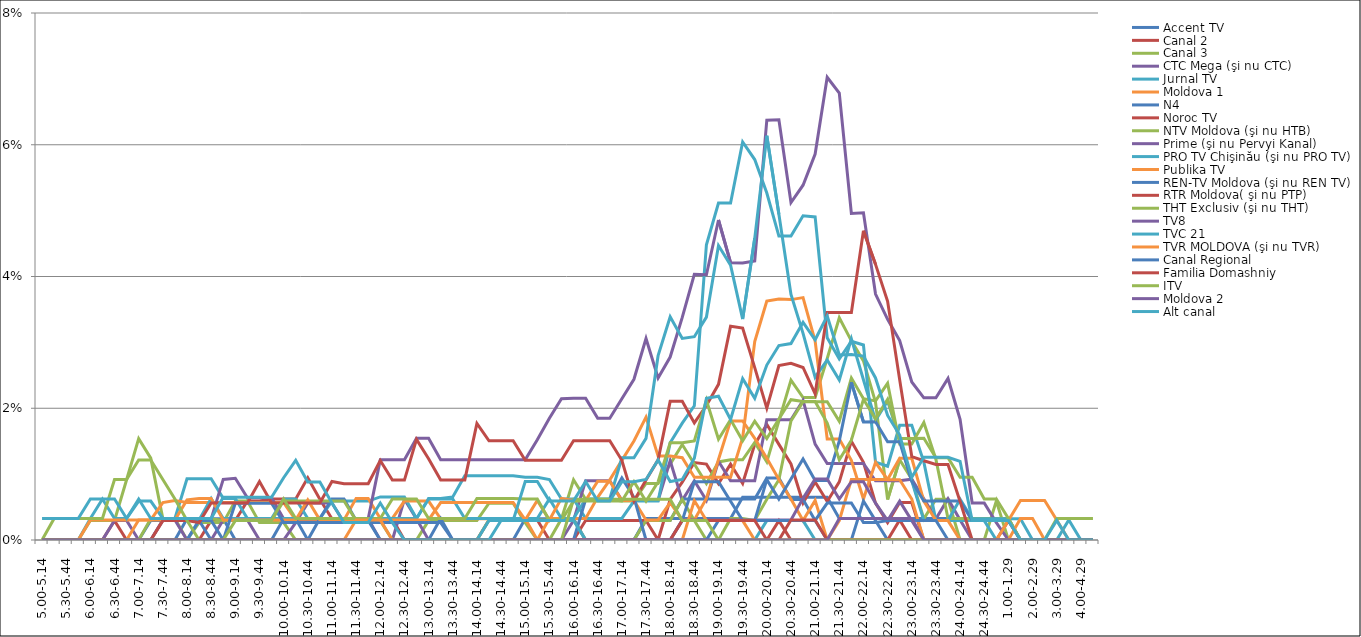
| Category | Accent TV | Canal 2 | Canal 3 | CTC Mega (şi nu CTC) | Jurnal TV | Moldova 1 | N4 | Noroc TV | NTV Moldova (şi nu HTB) | Prime (şi nu Pervyi Kanal) | PRO TV Chişinău (şi nu PRO TV) | Publika TV  | REN-TV Moldova (şi nu REN TV)  | RTR Moldova( şi nu PTP)  | THT Exclusiv (şi nu THT) | TV8 | TVC 21 | TVR MOLDOVA (şi nu TVR) | Canal Regional | Familia Domashniy | ITV | Moldova 2 | Alt canal |
|---|---|---|---|---|---|---|---|---|---|---|---|---|---|---|---|---|---|---|---|---|---|---|---|
| 5.00-5.14 | 0 | 0 | 0 | 0 | 0 | 0 | 0 | 0 | 0 | 0 | 0 | 0 | 0 | 0 | 0 | 0 | 0 | 0 | 0 | 0 | 0 | 0 | 0.003 |
| 5.15-5.29 | 0 | 0 | 0 | 0 | 0 | 0 | 0 | 0 | 0 | 0 | 0 | 0 | 0 | 0 | 0.003 | 0 | 0 | 0 | 0 | 0 | 0 | 0 | 0.003 |
| 5.30-5.44 | 0 | 0 | 0 | 0 | 0 | 0 | 0 | 0 | 0 | 0 | 0 | 0 | 0 | 0 | 0.003 | 0 | 0 | 0 | 0 | 0 | 0 | 0 | 0.003 |
| 5.45-5.59 | 0 | 0 | 0 | 0 | 0 | 0 | 0 | 0 | 0 | 0 | 0 | 0 | 0 | 0 | 0.003 | 0 | 0 | 0 | 0 | 0 | 0 | 0 | 0.003 |
| 6.00-6.14 | 0 | 0 | 0.003 | 0 | 0.003 | 0.003 | 0 | 0 | 0 | 0 | 0 | 0 | 0 | 0 | 0.003 | 0 | 0 | 0 | 0 | 0 | 0 | 0 | 0.006 |
| 6.15-6.29 | 0 | 0 | 0.003 | 0 | 0.006 | 0.003 | 0 | 0 | 0 | 0 | 0 | 0 | 0 | 0 | 0.003 | 0 | 0 | 0 | 0 | 0 | 0 | 0 | 0.006 |
| 6.30-6.44 | 0 | 0.003 | 0.003 | 0.003 | 0.003 | 0.003 | 0 | 0 | 0 | 0 | 0 | 0 | 0 | 0 | 0.009 | 0 | 0 | 0 | 0 | 0 | 0 | 0 | 0.006 |
| 6.45-6.59 | 0 | 0 | 0.009 | 0.003 | 0.003 | 0.003 | 0 | 0 | 0 | 0 | 0 | 0 | 0 | 0 | 0.009 | 0 | 0 | 0 | 0 | 0 | 0 | 0 | 0.003 |
| 7.00-7.14 | 0 | 0 | 0.015 | 0 | 0.006 | 0.003 | 0 | 0 | 0 | 0 | 0 | 0.003 | 0 | 0 | 0.012 | 0 | 0 | 0 | 0 | 0 | 0 | 0 | 0.006 |
| 7.15-7.29 | 0 | 0 | 0.012 | 0 | 0.006 | 0.003 | 0.003 | 0 | 0.003 | 0 | 0 | 0.003 | 0 | 0 | 0.012 | 0 | 0 | 0 | 0 | 0 | 0 | 0 | 0.003 |
| 7.30-7.44 | 0 | 0 | 0.003 | 0.003 | 0.003 | 0.006 | 0.003 | 0 | 0.003 | 0.003 | 0 | 0.003 | 0 | 0.003 | 0.009 | 0 | 0 | 0 | 0 | 0 | 0 | 0 | 0.003 |
| 7.45-7.59 | 0 | 0 | 0.003 | 0.003 | 0.003 | 0.006 | 0.003 | 0 | 0.003 | 0.003 | 0 | 0.003 | 0 | 0.003 | 0.006 | 0 | 0 | 0 | 0 | 0 | 0 | 0 | 0.003 |
| 8.00-8.14 | 0.003 | 0 | 0 | 0 | 0.009 | 0.006 | 0.003 | 0 | 0.003 | 0.003 | 0 | 0.006 | 0 | 0.003 | 0.003 | 0 | 0 | 0 | 0 | 0 | 0 | 0 | 0.003 |
| 8.15-8.29 | 0.003 | 0 | 0.003 | 0 | 0.009 | 0.006 | 0.003 | 0 | 0.003 | 0.003 | 0.003 | 0.006 | 0.003 | 0.003 | 0 | 0 | 0 | 0 | 0 | 0 | 0 | 0 | 0.003 |
| 8.30-8.44 | 0.003 | 0.003 | 0.003 | 0 | 0.009 | 0.006 | 0 | 0 | 0.003 | 0.003 | 0.006 | 0.006 | 0.003 | 0.006 | 0 | 0 | 0 | 0 | 0 | 0 | 0 | 0 | 0.003 |
| 8.45-8.59 | 0.003 | 0.003 | 0.003 | 0.003 | 0.006 | 0.006 | 0 | 0 | 0.003 | 0.009 | 0.003 | 0.003 | 0 | 0.006 | 0 | 0 | 0 | 0 | 0 | 0 | 0 | 0 | 0.006 |
| 9.00-9.14 | 0 | 0.003 | 0.006 | 0.003 | 0.006 | 0.006 | 0 | 0 | 0.003 | 0.009 | 0.003 | 0.003 | 0.006 | 0.006 | 0.003 | 0 | 0 | 0 | 0 | 0 | 0 | 0 | 0.006 |
| 9.15-9.29 | 0 | 0.006 | 0.006 | 0.003 | 0.003 | 0.006 | 0 | 0 | 0.003 | 0.006 | 0.003 | 0.003 | 0.006 | 0.006 | 0.003 | 0 | 0 | 0 | 0 | 0 | 0 | 0 | 0.006 |
| 9.30-9.44 | 0 | 0.006 | 0.003 | 0 | 0.003 | 0.006 | 0 | 0 | 0.003 | 0.006 | 0.003 | 0.003 | 0.006 | 0.009 | 0.003 | 0 | 0 | 0 | 0 | 0 | 0 | 0 | 0.006 |
| 9.45-9.59 | 0 | 0.006 | 0.003 | 0 | 0.003 | 0.006 | 0 | 0 | 0.003 | 0.006 | 0.003 | 0.003 | 0.006 | 0.006 | 0.003 | 0 | 0 | 0 | 0 | 0 | 0 | 0 | 0.006 |
| 10.00-10.14 | 0 | 0.006 | 0.003 | 0 | 0.006 | 0.006 | 0.003 | 0 | 0.006 | 0.003 | 0.003 | 0.003 | 0.003 | 0.006 | 0.006 | 0 | 0 | 0 | 0 | 0 | 0 | 0 | 0.009 |
| 10.15-10.29 | 0 | 0.006 | 0 | 0.003 | 0.006 | 0.003 | 0.003 | 0 | 0.006 | 0.003 | 0.003 | 0.003 | 0.003 | 0.006 | 0.003 | 0 | 0 | 0 | 0 | 0 | 0 | 0 | 0.012 |
| 10.30-10.44 | 0 | 0.009 | 0 | 0.006 | 0.003 | 0.003 | 0 | 0 | 0.006 | 0.003 | 0.003 | 0.006 | 0.003 | 0.006 | 0.003 | 0 | 0 | 0 | 0 | 0 | 0 | 0 | 0.009 |
| 10.45-10.59 | 0 | 0.006 | 0 | 0.006 | 0.003 | 0.003 | 0.003 | 0 | 0.006 | 0.003 | 0.003 | 0.003 | 0.003 | 0.006 | 0.003 | 0 | 0 | 0 | 0 | 0 | 0 | 0 | 0.009 |
| 11.00-11.14 | 0 | 0.003 | 0 | 0.006 | 0.006 | 0.003 | 0.006 | 0 | 0.006 | 0.003 | 0.003 | 0.003 | 0.003 | 0.009 | 0.003 | 0 | 0 | 0 | 0 | 0 | 0 | 0 | 0.006 |
| 11.15-11.29 | 0 | 0.003 | 0 | 0.003 | 0.006 | 0.003 | 0.006 | 0 | 0.006 | 0.003 | 0.003 | 0.003 | 0.003 | 0.009 | 0.003 | 0 | 0 | 0 | 0 | 0 | 0 | 0 | 0.003 |
| 11.30-11.44 | 0 | 0.003 | 0 | 0.003 | 0.006 | 0.006 | 0.003 | 0 | 0.003 | 0.003 | 0.003 | 0.003 | 0.003 | 0.009 | 0.003 | 0 | 0 | 0.003 | 0 | 0 | 0 | 0 | 0.003 |
| 11.45-11.59 | 0 | 0.003 | 0 | 0.003 | 0.006 | 0.006 | 0.003 | 0 | 0.003 | 0.003 | 0.003 | 0.003 | 0.003 | 0.009 | 0.003 | 0 | 0 | 0.003 | 0 | 0 | 0 | 0 | 0.003 |
| 12.00-12.14 | 0 | 0.003 | 0 | 0 | 0.007 | 0.003 | 0 | 0 | 0.003 | 0.012 | 0.003 | 0.003 | 0.003 | 0.012 | 0.003 | 0 | 0 | 0.003 | 0 | 0 | 0 | 0 | 0.006 |
| 12.15-12.29 | 0 | 0.003 | 0 | 0 | 0.007 | 0.003 | 0 | 0 | 0 | 0.012 | 0.003 | 0.003 | 0.003 | 0.009 | 0.006 | 0 | 0 | 0 | 0 | 0 | 0 | 0 | 0.003 |
| 12.30-12.44 | 0 | 0 | 0 | 0.006 | 0.007 | 0.006 | 0 | 0 | 0 | 0.012 | 0.003 | 0.003 | 0.003 | 0.009 | 0.006 | 0 | 0 | 0 | 0 | 0 | 0 | 0 | 0 |
| 12.45-12.59 | 0 | 0 | 0 | 0.003 | 0.003 | 0.006 | 0 | 0 | 0 | 0.015 | 0.003 | 0.003 | 0.003 | 0.015 | 0.006 | 0 | 0 | 0 | 0 | 0 | 0 | 0 | 0 |
| 13.00-13.14 | 0 | 0 | 0.003 | 0 | 0.006 | 0.006 | 0 | 0 | 0 | 0.015 | 0.006 | 0.003 | 0.003 | 0.012 | 0.003 | 0 | 0 | 0 | 0 | 0 | 0 | 0 | 0 |
| 13.15-13.29 | 0 | 0 | 0.003 | 0 | 0.006 | 0.003 | 0.003 | 0 | 0 | 0.012 | 0.006 | 0.006 | 0.003 | 0.009 | 0.003 | 0 | 0 | 0 | 0 | 0 | 0 | 0 | 0 |
| 13.30-13.44 | 0 | 0 | 0.003 | 0 | 0.007 | 0.003 | 0 | 0 | 0 | 0.012 | 0.006 | 0.006 | 0 | 0.009 | 0.003 | 0 | 0 | 0 | 0 | 0 | 0 | 0 | 0 |
| 13.45-13.59 | 0 | 0 | 0.003 | 0 | 0.01 | 0.003 | 0 | 0 | 0 | 0.012 | 0.003 | 0.006 | 0 | 0.009 | 0.003 | 0 | 0 | 0 | 0 | 0 | 0 | 0 | 0 |
| 14.00-14.14 | 0 | 0 | 0.003 | 0 | 0.01 | 0.003 | 0 | 0 | 0 | 0.012 | 0.003 | 0.006 | 0 | 0.018 | 0.006 | 0 | 0 | 0 | 0 | 0 | 0 | 0 | 0 |
| 14.15-14.29 | 0 | 0.003 | 0.006 | 0 | 0.01 | 0.003 | 0 | 0 | 0.003 | 0.012 | 0.003 | 0.006 | 0 | 0.015 | 0.006 | 0 | 0.003 | 0 | 0 | 0 | 0 | 0 | 0 |
| 14.30-14.44 | 0 | 0.003 | 0.006 | 0 | 0.01 | 0.003 | 0 | 0 | 0.003 | 0.012 | 0.003 | 0.006 | 0 | 0.015 | 0.006 | 0 | 0.003 | 0 | 0 | 0 | 0 | 0 | 0.003 |
| 14.45-14.59 | 0 | 0.003 | 0.006 | 0 | 0.01 | 0.003 | 0 | 0 | 0.003 | 0.012 | 0.003 | 0.006 | 0 | 0.015 | 0.006 | 0 | 0.003 | 0 | 0 | 0 | 0 | 0 | 0.003 |
| 15.00-15.14 | 0.003 | 0.003 | 0.003 | 0 | 0.01 | 0.003 | 0 | 0 | 0.003 | 0.012 | 0.003 | 0.003 | 0 | 0.012 | 0.006 | 0 | 0.003 | 0 | 0 | 0 | 0 | 0 | 0.009 |
| 15.15-15.29 | 0.003 | 0.003 | 0 | 0 | 0.01 | 0 | 0 | 0 | 0.003 | 0.015 | 0.003 | 0.006 | 0 | 0.012 | 0.006 | 0 | 0.003 | 0 | 0 | 0 | 0 | 0 | 0.009 |
| 15.30-15.44 | 0.003 | 0 | 0 | 0 | 0.009 | 0.003 | 0 | 0 | 0.003 | 0.018 | 0.006 | 0.003 | 0 | 0.012 | 0.003 | 0 | 0.003 | 0 | 0 | 0 | 0 | 0 | 0.006 |
| 15.45-15.59 | 0.003 | 0 | 0.003 | 0 | 0.006 | 0.003 | 0 | 0 | 0.003 | 0.021 | 0.003 | 0.006 | 0 | 0.012 | 0.003 | 0 | 0.003 | 0 | 0 | 0 | 0 | 0 | 0.006 |
| 16.00-16.14 | 0.003 | 0 | 0.009 | 0.003 | 0.006 | 0.003 | 0 | 0 | 0.003 | 0.022 | 0.003 | 0.006 | 0 | 0.015 | 0.006 | 0 | 0.003 | 0 | 0 | 0 | 0.006 | 0 | 0.006 |
| 16.15-16.29 | 0 | 0.003 | 0.006 | 0.009 | 0.003 | 0.003 | 0 | 0 | 0 | 0.022 | 0.006 | 0.006 | 0.006 | 0.015 | 0.006 | 0 | 0 | 0 | 0 | 0 | 0.006 | 0 | 0.009 |
| 16.30-16.44 | 0 | 0.003 | 0.006 | 0.009 | 0.003 | 0.006 | 0 | 0 | 0 | 0.018 | 0.006 | 0.009 | 0.006 | 0.015 | 0.006 | 0 | 0 | 0 | 0 | 0 | 0.006 | 0 | 0.006 |
| 16.45-16.59 | 0 | 0.003 | 0.006 | 0.009 | 0.003 | 0.009 | 0 | 0 | 0 | 0.018 | 0.006 | 0.009 | 0.006 | 0.015 | 0.006 | 0 | 0 | 0 | 0 | 0 | 0.006 | 0 | 0.006 |
| 17.00-17.14 | 0 | 0.003 | 0.006 | 0.006 | 0.003 | 0.012 | 0 | 0 | 0 | 0.021 | 0.012 | 0.006 | 0.009 | 0.012 | 0.006 | 0 | 0 | 0 | 0 | 0 | 0.006 | 0 | 0.009 |
| 17.15-17.29 | 0 | 0.003 | 0.006 | 0.006 | 0.006 | 0.015 | 0 | 0 | 0 | 0.024 | 0.012 | 0.006 | 0.006 | 0.006 | 0.009 | 0 | 0 | 0 | 0 | 0 | 0.006 | 0 | 0.009 |
| 17.30-17.44 | 0.003 | 0.003 | 0.009 | 0.006 | 0.006 | 0.019 | 0.003 | 0 | 0.003 | 0.031 | 0.015 | 0.003 | 0 | 0.009 | 0.006 | 0 | 0 | 0 | 0 | 0 | 0.006 | 0 | 0.009 |
| 17.45-17.59 | 0.003 | 0 | 0.009 | 0.006 | 0.006 | 0.013 | 0.003 | 0 | 0.003 | 0.025 | 0.028 | 0.003 | 0 | 0.012 | 0.009 | 0 | 0 | 0 | 0 | 0 | 0.006 | 0 | 0.012 |
| 18.00-18.14 | 0.003 | 0.006 | 0.012 | 0.012 | 0.015 | 0.013 | 0.003 | 0 | 0.003 | 0.028 | 0.034 | 0.006 | 0 | 0.021 | 0.015 | 0 | 0 | 0 | 0 | 0 | 0.006 | 0 | 0.009 |
| 18.15-18.29 | 0.003 | 0.009 | 0.014 | 0.006 | 0.018 | 0.012 | 0.006 | 0 | 0.006 | 0.034 | 0.031 | 0.003 | 0.003 | 0.021 | 0.015 | 0.003 | 0 | 0 | 0 | 0.003 | 0.003 | 0 | 0.009 |
| 18.30-18.44 | 0.003 | 0.012 | 0.012 | 0.009 | 0.02 | 0.01 | 0.006 | 0 | 0.003 | 0.04 | 0.031 | 0.003 | 0.009 | 0.018 | 0.015 | 0.003 | 0 | 0.006 | 0 | 0.003 | 0.003 | 0 | 0.012 |
| 18.45-18.59 | 0.003 | 0.012 | 0.009 | 0.006 | 0.045 | 0.01 | 0.006 | 0 | 0 | 0.04 | 0.034 | 0.006 | 0.009 | 0.02 | 0.021 | 0.003 | 0 | 0.003 | 0 | 0.003 | 0.003 | 0 | 0.022 |
| 19.00-19.14 | 0.003 | 0.009 | 0.012 | 0.012 | 0.051 | 0.01 | 0.006 | 0 | 0 | 0.049 | 0.045 | 0.012 | 0.009 | 0.024 | 0.015 | 0.003 | 0 | 0.003 | 0.003 | 0.003 | 0 | 0 | 0.022 |
| 19.15-19.29 | 0.003 | 0.012 | 0.012 | 0.009 | 0.051 | 0.01 | 0.006 | 0 | 0.003 | 0.042 | 0.042 | 0.018 | 0.006 | 0.032 | 0.018 | 0.003 | 0 | 0.003 | 0.003 | 0.003 | 0 | 0 | 0.018 |
| 19.30-19.44 | 0.006 | 0.009 | 0.012 | 0.009 | 0.06 | 0.016 | 0.006 | 0 | 0.003 | 0.042 | 0.034 | 0.018 | 0.003 | 0.032 | 0.015 | 0.003 | 0 | 0.003 | 0.003 | 0.003 | 0 | 0 | 0.024 |
| 19.45-19.59 | 0.006 | 0.015 | 0.015 | 0.009 | 0.058 | 0.03 | 0.006 | 0 | 0.003 | 0.042 | 0.046 | 0.015 | 0.003 | 0.026 | 0.018 | 0.003 | 0 | 0 | 0.003 | 0.003 | 0 | 0 | 0.022 |
| 20.00-20.14 | 0.006 | 0.018 | 0.012 | 0.018 | 0.053 | 0.036 | 0.009 | 0 | 0.006 | 0.064 | 0.061 | 0.012 | 0.009 | 0.02 | 0.015 | 0.003 | 0.003 | 0 | 0.003 | 0 | 0 | 0 | 0.027 |
| 20.15-20.29 | 0.006 | 0.015 | 0.018 | 0.018 | 0.046 | 0.037 | 0.009 | 0.003 | 0.009 | 0.064 | 0.049 | 0.009 | 0.006 | 0.026 | 0.018 | 0.003 | 0.003 | 0 | 0.003 | 0 | 0 | 0 | 0.03 |
| 20.30-20.44 | 0.006 | 0.012 | 0.024 | 0.018 | 0.046 | 0.036 | 0.006 | 0 | 0.018 | 0.051 | 0.037 | 0.006 | 0.009 | 0.027 | 0.021 | 0.003 | 0.003 | 0 | 0.003 | 0.003 | 0 | 0 | 0.03 |
| 20.45-20.59 | 0.006 | 0.006 | 0.022 | 0.021 | 0.049 | 0.037 | 0.006 | 0 | 0.021 | 0.054 | 0.031 | 0.003 | 0.012 | 0.026 | 0.021 | 0.006 | 0.003 | 0 | 0.003 | 0.003 | 0 | 0 | 0.033 |
| 21.00-21.14 | 0.006 | 0.009 | 0.022 | 0.015 | 0.049 | 0.03 | 0.003 | 0 | 0.021 | 0.059 | 0.025 | 0.006 | 0.009 | 0.022 | 0.021 | 0.009 | 0 | 0 | 0.003 | 0.003 | 0 | 0 | 0.03 |
| 21.15-21.29 | 0.006 | 0.006 | 0.028 | 0.012 | 0.031 | 0.015 | 0 | 0 | 0.021 | 0.07 | 0.027 | 0 | 0.009 | 0.035 | 0.018 | 0.009 | 0 | 0 | 0.006 | 0 | 0 | 0 | 0.034 |
| 21.30-21.44 | 0.003 | 0.009 | 0.034 | 0.012 | 0.027 | 0.015 | 0 | 0 | 0.018 | 0.068 | 0.024 | 0.003 | 0.015 | 0.035 | 0.012 | 0.006 | 0 | 0 | 0.006 | 0 | 0 | 0.003 | 0.028 |
| 21.45-21.59 | 0.003 | 0.015 | 0.03 | 0.012 | 0.03 | 0.012 | 0 | 0 | 0.025 | 0.05 | 0.031 | 0.009 | 0.024 | 0.035 | 0.015 | 0.009 | 0 | 0 | 0.006 | 0 | 0 | 0.003 | 0.028 |
| 22.00-22.14 | 0.003 | 0.012 | 0.027 | 0.012 | 0.03 | 0.006 | 0.006 | 0 | 0.021 | 0.05 | 0.024 | 0.009 | 0.018 | 0.047 | 0.021 | 0.009 | 0 | 0 | 0.003 | 0 | 0 | 0.003 | 0.028 |
| 22.15-22.29 | 0.003 | 0.006 | 0.021 | 0.009 | 0.012 | 0.012 | 0.003 | 0 | 0.021 | 0.037 | 0.018 | 0.009 | 0.018 | 0.042 | 0.018 | 0.006 | 0 | 0 | 0.003 | 0 | 0 | 0.003 | 0.025 |
| 22.30-22.44 | 0.003 | 0.003 | 0.006 | 0.009 | 0.011 | 0.009 | 0 | 0 | 0.024 | 0.033 | 0.021 | 0.009 | 0.015 | 0.036 | 0.021 | 0.003 | 0 | 0 | 0.003 | 0 | 0 | 0.003 | 0.019 |
| 22.45-22.59 | 0.003 | 0.006 | 0.012 | 0.009 | 0.017 | 0.009 | 0 | 0.003 | 0.015 | 0.03 | 0.015 | 0.012 | 0.015 | 0.024 | 0.015 | 0.006 | 0 | 0 | 0.003 | 0 | 0 | 0.003 | 0.016 |
| 23.00-23.14 | 0.003 | 0.006 | 0.009 | 0.009 | 0.017 | 0.006 | 0 | 0 | 0.015 | 0.024 | 0.009 | 0.012 | 0.009 | 0.013 | 0.015 | 0.003 | 0 | 0 | 0.003 | 0 | 0 | 0.003 | 0.01 |
| 23.15-23.29 | 0.003 | 0 | 0.003 | 0.006 | 0.012 | 0 | 0 | 0 | 0.018 | 0.022 | 0.003 | 0.006 | 0.006 | 0.012 | 0.015 | 0 | 0 | 0 | 0.003 | 0 | 0 | 0 | 0.013 |
| 23.30-23.44 | 0.003 | 0 | 0.006 | 0.003 | 0.003 | 0 | 0 | 0 | 0.012 | 0.022 | 0.003 | 0.003 | 0.006 | 0.011 | 0.012 | 0 | 0 | 0 | 0.003 | 0 | 0 | 0 | 0.013 |
| 23.45-23.59 | 0.003 | 0 | 0.006 | 0.006 | 0.003 | 0 | 0 | 0 | 0.003 | 0.025 | 0.003 | 0.003 | 0.006 | 0.011 | 0.012 | 0 | 0 | 0 | 0 | 0 | 0 | 0 | 0.013 |
| 24.00-24.14 | 0.003 | 0 | 0 | 0.003 | 0.003 | 0 | 0 | 0 | 0.003 | 0.018 | 0.006 | 0 | 0.006 | 0.006 | 0.01 | 0 | 0 | 0 | 0 | 0 | 0 | 0 | 0.012 |
| 24.15-24.29 | 0.003 | 0 | 0 | 0 | 0.003 | 0 | 0 | 0 | 0.003 | 0.006 | 0.003 | 0 | 0.003 | 0 | 0.01 | 0 | 0 | 0 | 0 | 0 | 0 | 0 | 0.003 |
| 24.30-24.44 | 0.003 | 0 | 0 | 0 | 0.003 | 0 | 0 | 0 | 0.003 | 0.006 | 0.003 | 0 | 0.003 | 0 | 0.006 | 0 | 0 | 0 | 0 | 0 | 0 | 0 | 0.003 |
| 24.45-24.59 | 0.003 | 0 | 0.006 | 0 | 0 | 0 | 0 | 0 | 0.003 | 0.003 | 0.003 | 0 | 0.003 | 0 | 0.006 | 0 | 0 | 0 | 0 | 0 | 0 | 0 | 0.003 |
| 1.00-1.29 | 0.003 | 0.003 | 0 | 0 | 0 | 0 | 0 | 0 | 0.003 | 0 | 0.003 | 0.003 | 0.003 | 0 | 0.003 | 0 | 0 | 0 | 0 | 0 | 0 | 0 | 0.003 |
| 1.30-1. 59 | 0 | 0 | 0 | 0 | 0 | 0 | 0 | 0 | 0 | 0 | 0.003 | 0.006 | 0 | 0 | 0 | 0 | 0 | 0.003 | 0 | 0 | 0 | 0 | 0 |
| 2.00-2.29 | 0 | 0 | 0 | 0 | 0 | 0 | 0 | 0 | 0 | 0 | 0 | 0.006 | 0 | 0 | 0 | 0 | 0 | 0.003 | 0 | 0 | 0 | 0 | 0 |
| 2.30-2.59 | 0 | 0 | 0 | 0 | 0 | 0 | 0 | 0 | 0 | 0 | 0 | 0.006 | 0 | 0 | 0 | 0 | 0 | 0 | 0 | 0 | 0 | 0 | 0 |
| 3.00-3.29 | 0 | 0 | 0 | 0 | 0 | 0 | 0 | 0 | 0 | 0 | 0 | 0.003 | 0 | 0 | 0.003 | 0 | 0 | 0 | 0 | 0 | 0 | 0 | 0.003 |
| 3.30-3.59 | 0 | 0 | 0 | 0 | 0 | 0 | 0 | 0 | 0 | 0 | 0.003 | 0 | 0 | 0 | 0.003 | 0 | 0 | 0 | 0 | 0 | 0 | 0 | 0 |
| 4.00-4.29 | 0 | 0 | 0 | 0 | 0 | 0 | 0 | 0 | 0 | 0 | 0 | 0 | 0 | 0 | 0.003 | 0 | 0 | 0 | 0 | 0 | 0 | 0 | 0 |
| 4.30-4.59 | 0 | 0 | 0 | 0 | 0 | 0 | 0 | 0 | 0 | 0 | 0 | 0 | 0 | 0 | 0.003 | 0 | 0 | 0 | 0 | 0 | 0 | 0 | 0 |